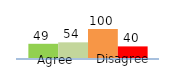
| Category | Series 0 | Series 1 | Series 2 | Series 3 |
|---|---|---|---|---|
| 0 | 49 | 54 | 100 | 40 |